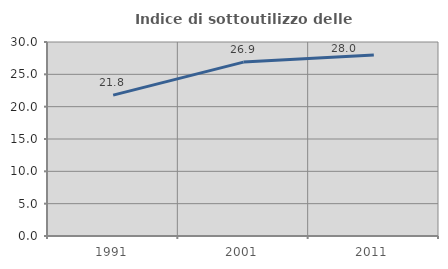
| Category | Indice di sottoutilizzo delle abitazioni  |
|---|---|
| 1991.0 | 21.79 |
| 2001.0 | 26.892 |
| 2011.0 | 27.977 |